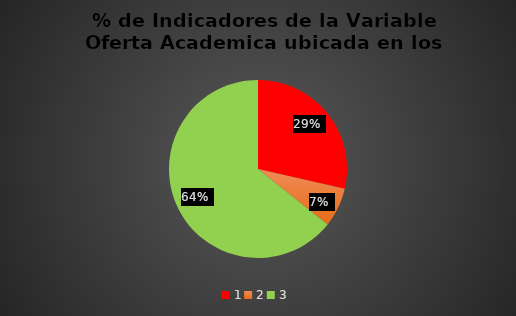
| Category | Series 0 |
|---|---|
| 0 | 0.286 |
| 1 | 0.071 |
| 2 | 0.643 |